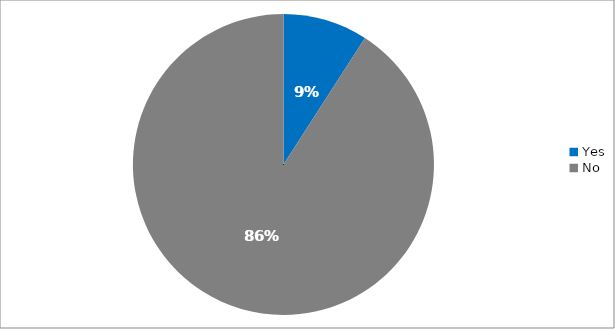
| Category | Responses |
|---|---|
| Yes | 0.087 |
| No | 0.865 |